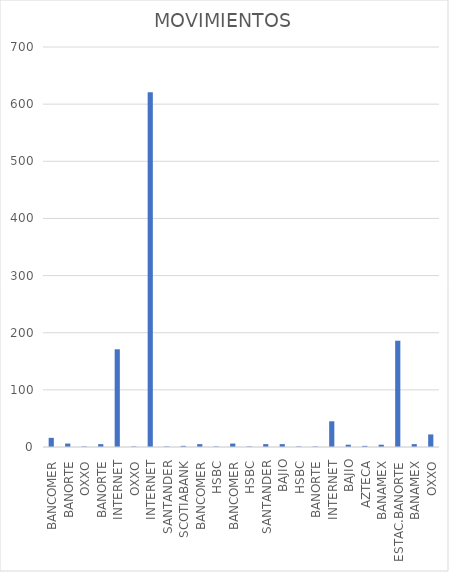
| Category | MOVIMIENTOS |
|---|---|
| BANCOMER | 16 |
| BANORTE | 6 |
| OXXO | 1 |
| BANORTE | 5 |
| INTERNET | 171 |
| OXXO | 1 |
| INTERNET | 621 |
| SANTANDER | 1 |
| SCOTIABANK | 2 |
| BANCOMER | 5 |
| HSBC | 1 |
| BANCOMER | 6 |
| HSBC | 1 |
| SANTANDER | 5 |
| BAJIO | 5 |
| HSBC | 1 |
| BANORTE | 1 |
| INTERNET | 45 |
| BAJIO | 4 |
| AZTECA | 2 |
| BANAMEX | 4 |
| ESTAC.BANORTE | 186 |
| BANAMEX | 5 |
| OXXO | 22 |